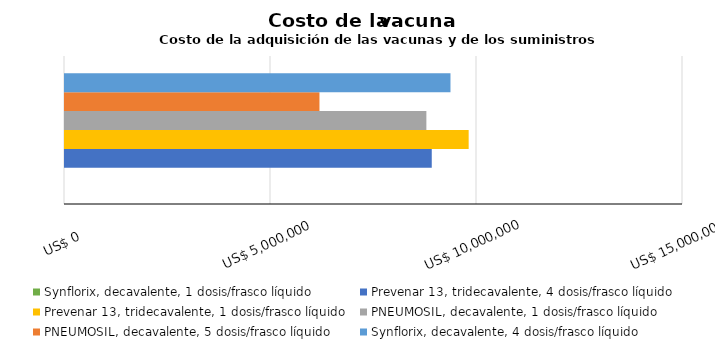
| Category | Synflorix, decavalente, 1 dosis/frasco líquido | Prevenar 13, tridecavalente, 4 dosis/frasco líquido | Prevenar 13, tridecavalente, 1 dosis/frasco líquido | PNEUMOSIL, decavalente, 1 dosis/frasco líquido | PNEUMOSIL, decavalente, 5 dosis/frasco líquido | Synflorix, decavalente, 4 dosis/frasco líquido |
|---|---|---|---|---|---|---|
| Total
para 10 años | 0 | 8901935.55 | 9797721.506 | 8771233.685 | 6176323.48 | 9356204.229 |